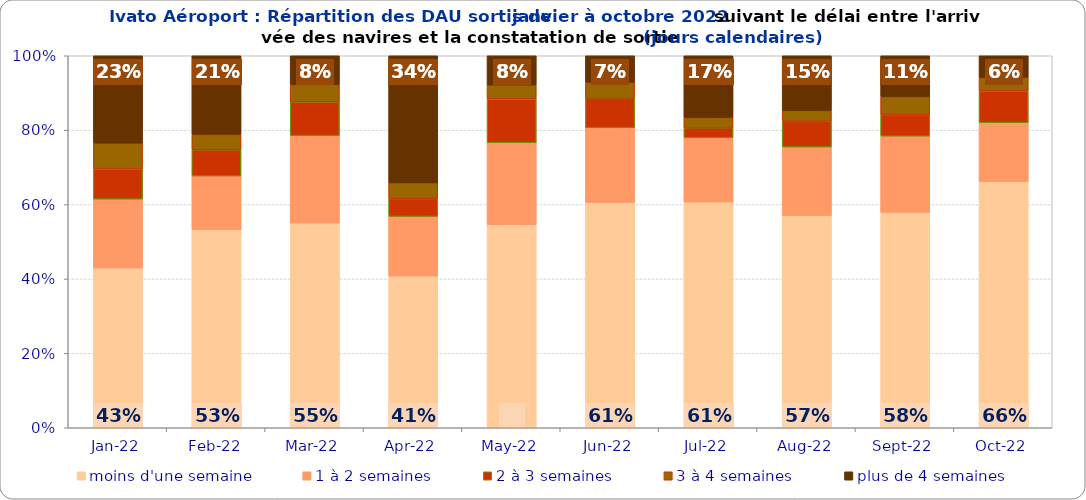
| Category | moins d'une semaine | 1 à 2 semaines | 2 à 3 semaines | 3 à 4 semaines | plus de 4 semaines |
|---|---|---|---|---|---|
| 2022-01-01 | 0.429 | 0.185 | 0.081 | 0.07 | 0.235 |
| 2022-02-01 | 0.532 | 0.145 | 0.07 | 0.041 | 0.211 |
| 2022-03-01 | 0.55 | 0.235 | 0.09 | 0.047 | 0.078 |
| 2022-04-01 | 0.408 | 0.16 | 0.048 | 0.042 | 0.342 |
| 2022-05-01 | 0.547 | 0.219 | 0.118 | 0.037 | 0.079 |
| 2022-06-01 | 0.606 | 0.201 | 0.079 | 0.043 | 0.071 |
| 2022-07-01 | 0.607 | 0.173 | 0.026 | 0.029 | 0.166 |
| 2022-08-01 | 0.571 | 0.184 | 0.069 | 0.029 | 0.147 |
| 2022-09-01 | 0.579 | 0.205 | 0.058 | 0.048 | 0.11 |
| 2022-10-01 | 0.662 | 0.158 | 0.085 | 0.036 | 0.058 |